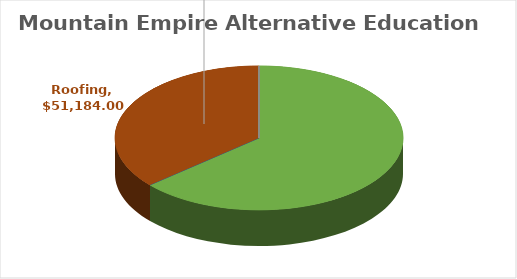
| Category | Series 0 |
|---|---|
| Electrical | 0 |
| Fencing | 0 |
| Finishes | 0 |
| HVAC | 0 |
| LowVoltage | 0 |
| Paving | 89643.8 |
| Plumbing | 0 |
| Roofing | 51184 |
| Playground | 0 |